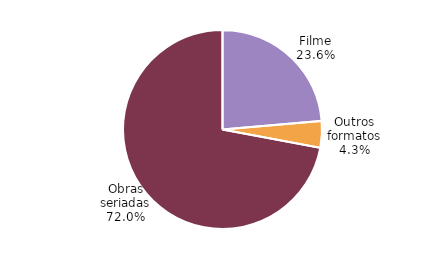
| Category | Series 0 |
|---|---|
| Filme | 0.236 |
| Outros formatos | 0.043 |
| Obras seriadas | 0.72 |